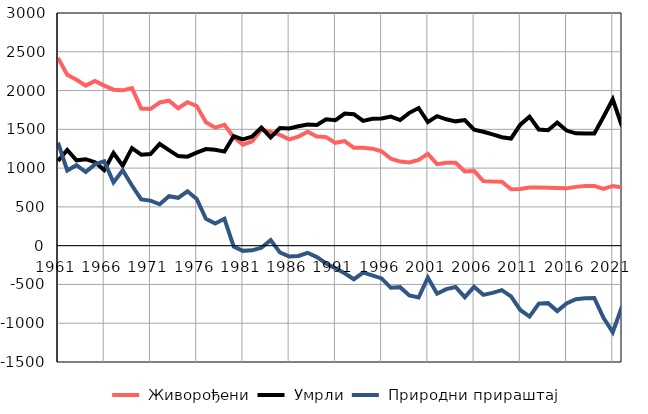
| Category |  Живорођени |  Умрли |  Природни прираштај |
|---|---|---|---|
| 1961.0 | 2420 | 1093 | 1327 |
| 1962.0 | 2204 | 1234 | 970 |
| 1963.0 | 2139 | 1101 | 1038 |
| 1964.0 | 2064 | 1115 | 949 |
| 1965.0 | 2124 | 1076 | 1048 |
| 1966.0 | 2064 | 974 | 1090 |
| 1967.0 | 2011 | 1195 | 816 |
| 1968.0 | 2003 | 1031 | 972 |
| 1969.0 | 2033 | 1257 | 776 |
| 1970.0 | 1769 | 1173 | 596 |
| 1971.0 | 1762 | 1181 | 581 |
| 1972.0 | 1846 | 1312 | 534 |
| 1973.0 | 1869 | 1231 | 638 |
| 1974.0 | 1772 | 1155 | 617 |
| 1975.0 | 1849 | 1148 | 701 |
| 1976.0 | 1801 | 1199 | 602 |
| 1977.0 | 1592 | 1245 | 347 |
| 1978.0 | 1522 | 1236 | 286 |
| 1979.0 | 1559 | 1213 | 346 |
| 1980.0 | 1401 | 1411 | -10 |
| 1981.0 | 1303 | 1370 | -67 |
| 1982.0 | 1347 | 1407 | -60 |
| 1983.0 | 1495 | 1521 | -26 |
| 1984.0 | 1467 | 1395 | 72 |
| 1985.0 | 1429 | 1517 | -88 |
| 1986.0 | 1371 | 1510 | -139 |
| 1987.0 | 1407 | 1539 | -132 |
| 1988.0 | 1469 | 1561 | -92 |
| 1989.0 | 1408 | 1555 | -147 |
| 1990.0 | 1400 | 1630 | -230 |
| 1991.0 | 1326 | 1617 | -291 |
| 1992.0 | 1348 | 1704 | -356 |
| 1993.0 | 1262 | 1695 | -433 |
| 1994.0 | 1261 | 1609 | -348 |
| 1995.0 | 1251 | 1635 | -384 |
| 1996.0 | 1218 | 1640 | -422 |
| 1997.0 | 1121 | 1664 | -543 |
| 1998.0 | 1084 | 1619 | -535 |
| 1999.0 | 1072 | 1713 | -641 |
| 2000.0 | 1106 | 1775 | -669 |
| 2001.0 | 1183 | 1594 | -411 |
| 2002.0 | 1051 | 1670 | -619 |
| 2003.0 | 1068 | 1629 | -561 |
| 2004.0 | 1070 | 1603 | -533 |
| 2005.0 | 956 | 1620 | -664 |
| 2006.0 | 964 | 1495 | -531 |
| 2007.0 | 834 | 1468 | -634 |
| 2008.0 | 827 | 1436 | -609 |
| 2009.0 | 825 | 1398 | -573 |
| 2010.0 | 727 | 1382 | -655 |
| 2011.0 | 731 | 1560 | -829 |
| 2012.0 | 749 | 1663 | -914 |
| 2013.0 | 751 | 1498 | -747 |
| 2014.0 | 747 | 1488 | -741 |
| 2015.0 | 744 | 1588 | -844 |
| 2016.0 | 739 | 1484 | -745 |
| 2017.0 | 758 | 1448 | -690 |
| 2018.0 | 768 | 1445 | -677 |
| 2019.0 | 770 | 1445 | -675 |
| 2020.0 | 732 | 1663 | -931 |
| 2021.0 | 770 | 1887 | -1117 |
| 2022.0 | 752 | 1537 | -785 |